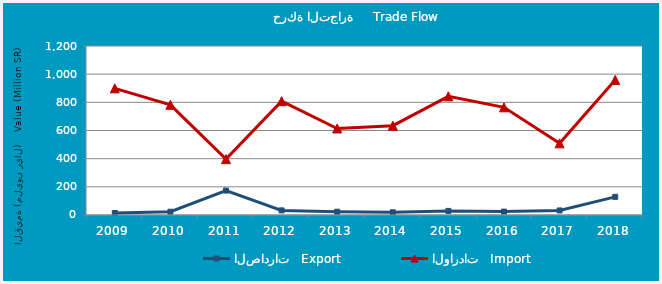
| Category | الصادرات   Export | الواردات   Import |
|---|---|---|
| 2009.0 | 14446885 | 899165614 |
| 2010.0 | 23402271 | 782271385 |
| 2011.0 | 173407361 | 396561414 |
| 2012.0 | 32674732 | 808245974 |
| 2013.0 | 23381383 | 614370751 |
| 2014.0 | 19237580 | 634163018 |
| 2015.0 | 29124429 | 842679997 |
| 2016.0 | 24026471 | 764554030 |
| 2017.0 | 32294897 | 508904660 |
| 2018.0 | 128851136 | 959306780 |